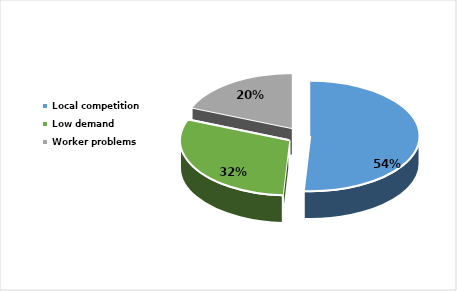
| Category | Series 0 |
|---|---|
| Local competition  | 0.54 |
| Low demand  | 0.32 |
| Worker problems  | 0.2 |